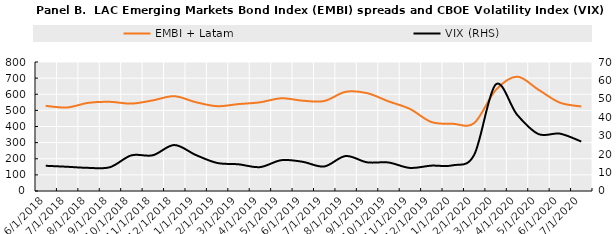
| Category | EMBI + Latam |
|---|---|
| 6/29/18 | 528 |
| 7/31/18 | 518 |
| 8/31/18 | 547 |
| 9/28/18 | 553 |
| 10/31/18 | 542 |
| 11/30/18 | 562 |
| 12/31/18 | 588 |
| 1/31/19 | 551 |
| 2/28/19 | 526 |
| 3/29/19 | 539 |
| 4/30/19 | 550 |
| 5/31/19 | 575 |
| 6/28/19 | 560 |
| 7/31/19 | 558 |
| 8/30/19 | 615 |
| 9/30/19 | 607 |
| 10/31/19 | 556 |
| 11/29/19 | 509 |
| 12/31/19 | 428 |
| 1/31/20 | 417 |
| 2/28/20 | 421 |
| 3/31/20 | 625 |
| 4/30/20 | 709 |
| 5/29/20 | 628 |
| 6/30/20 | 548 |
| 7/31/20 | 524 |